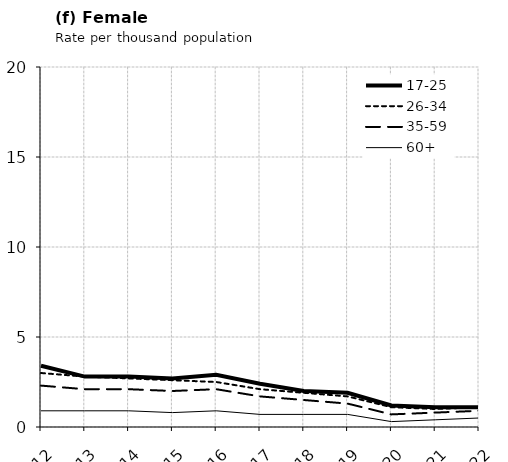
| Category | 17-25 | 26-34 | 35-59 | 60+ |
|---|---|---|---|---|
| 2012.0 | 3.4 | 3 | 2.3 | 0.9 |
| 2013.0 | 2.8 | 2.8 | 2.1 | 0.9 |
| 2014.0 | 2.8 | 2.7 | 2.1 | 0.9 |
| 2015.0 | 2.7 | 2.6 | 2 | 0.8 |
| 2016.0 | 2.9 | 2.5 | 2.1 | 0.9 |
| 2017.0 | 2.4 | 2.1 | 1.7 | 0.7 |
| 2018.0 | 2 | 1.9 | 1.5 | 0.7 |
| 2019.0 | 1.9 | 1.7 | 1.3 | 0.7 |
| 2020.0 | 1.2 | 1.1 | 0.7 | 0.3 |
| 2021.0 | 1.1 | 1 | 0.8 | 0.4 |
| 2022.0 | 1.1 | 1.1 | 0.9 | 0.5 |